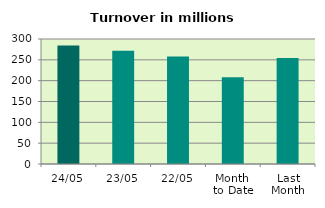
| Category | Series 0 |
|---|---|
| 24/05 | 284.447 |
| 23/05 | 271.712 |
| 22/05 | 257.713 |
| Month 
to Date | 208.354 |
| Last
Month | 254.458 |